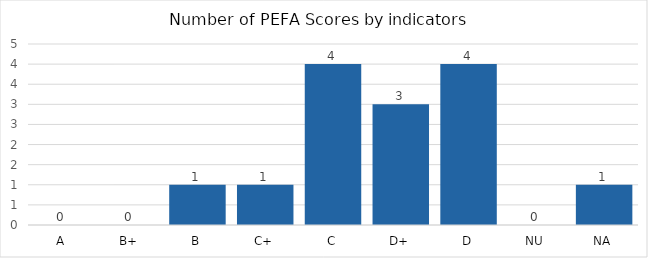
| Category |   | 2022 |
|---|---|---|
| A |  | 0 |
| B+ |  | 0 |
| B |  | 1 |
| C+ |  | 1 |
| C |  | 4 |
| D+ |  | 3 |
| D |  | 4 |
| NU |  | 0 |
| NA |  | 1 |